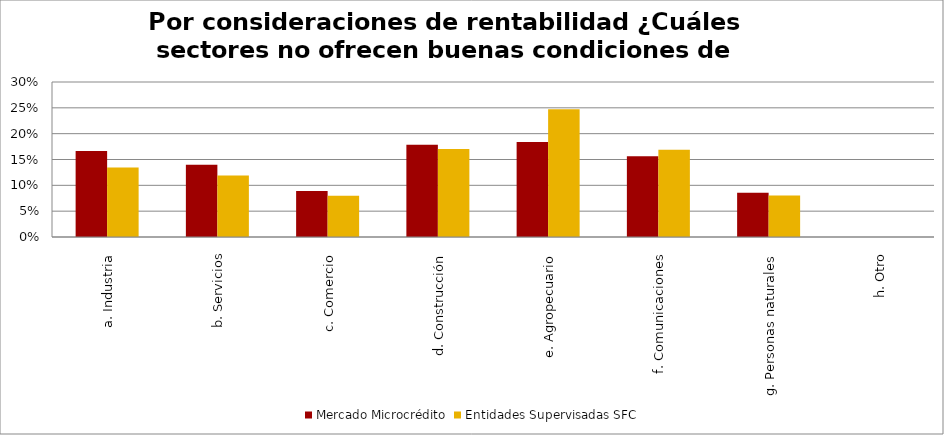
| Category | Mercado Microcrédito | Entidades Supervisadas SFC |
|---|---|---|
| a. Industria | 0.167 | 0.134 |
| b. Servicios | 0.14 | 0.119 |
| c. Comercio | 0.089 | 0.08 |
| d. Construcción | 0.178 | 0.17 |
| e. Agropecuario | 0.184 | 0.247 |
| f. Comunicaciones | 0.156 | 0.169 |
| g. Personas naturales | 0.086 | 0.08 |
| h. Otro | 0 | 0 |